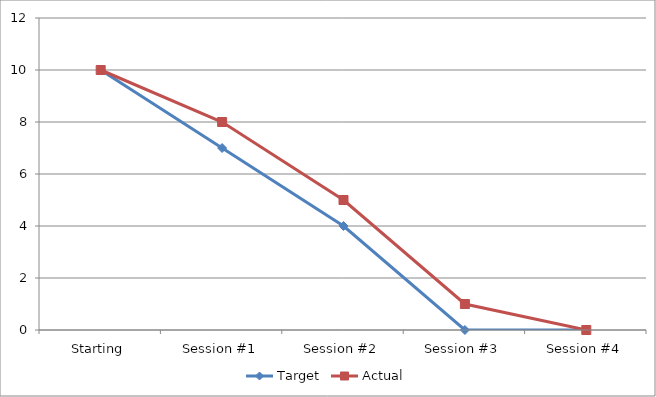
| Category | Target | Actual |
|---|---|---|
| Starting | 10 | 10 |
| Session #1 | 7 | 8 |
| Session #2 | 4 | 5 |
| Session #3 | 0 | 1 |
| Session #4 | 0 | 0 |